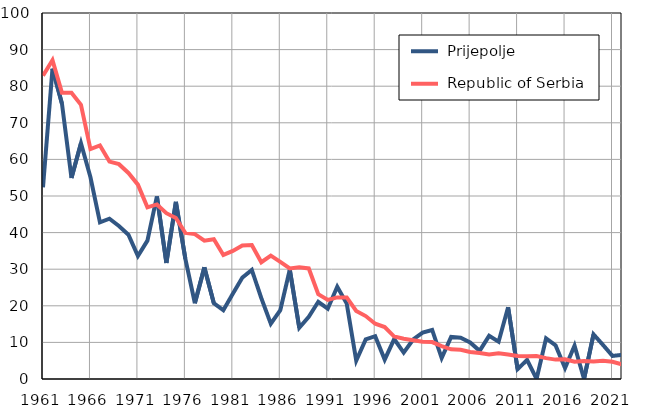
| Category |  Prijepolje |  Republic of Serbia |
|---|---|---|
| 1961.0 | 52.4 | 82.9 |
| 1962.0 | 84.8 | 87.1 |
| 1963.0 | 75.2 | 78.2 |
| 1964.0 | 54.9 | 78.2 |
| 1965.0 | 64.4 | 74.9 |
| 1966.0 | 55.1 | 62.8 |
| 1967.0 | 42.8 | 63.8 |
| 1968.0 | 43.8 | 59.4 |
| 1969.0 | 41.8 | 58.7 |
| 1970.0 | 39.4 | 56.3 |
| 1971.0 | 33.6 | 53.1 |
| 1972.0 | 37.8 | 46.9 |
| 1973.0 | 49.9 | 47.7 |
| 1974.0 | 31.7 | 45.3 |
| 1975.0 | 48.4 | 44 |
| 1976.0 | 32.8 | 39.9 |
| 1977.0 | 20.7 | 39.6 |
| 1978.0 | 30.5 | 37.8 |
| 1979.0 | 20.7 | 38.2 |
| 1980.0 | 18.8 | 33.9 |
| 1981.0 | 23.3 | 35 |
| 1982.0 | 27.7 | 36.5 |
| 1983.0 | 29.8 | 36.6 |
| 1984.0 | 22.1 | 31.9 |
| 1985.0 | 15.1 | 33.7 |
| 1986.0 | 18.8 | 32 |
| 1987.0 | 29.9 | 30.2 |
| 1988.0 | 14 | 30.5 |
| 1989.0 | 17 | 30.2 |
| 1990.0 | 21.1 | 23.2 |
| 1991.0 | 19.2 | 21.6 |
| 1992.0 | 25.2 | 22.3 |
| 1993.0 | 20.6 | 22.3 |
| 1994.0 | 5 | 18.6 |
| 1995.0 | 10.8 | 17.2 |
| 1996.0 | 11.7 | 15.1 |
| 1997.0 | 5.3 | 14.2 |
| 1998.0 | 10.9 | 11.6 |
| 1999.0 | 7.2 | 11 |
| 2000.0 | 10.8 | 10.6 |
| 2001.0 | 12.7 | 10.2 |
| 2002.0 | 13.4 | 10.1 |
| 2003.0 | 5.7 | 9 |
| 2004.0 | 11.5 | 8.1 |
| 2005.0 | 11.3 | 8 |
| 2006.0 | 10 | 7.4 |
| 2007.0 | 7.7 | 7.1 |
| 2008.0 | 11.8 | 6.7 |
| 2009.0 | 10.2 | 7 |
| 2010.0 | 19.6 | 6.7 |
| 2011.0 | 2.7 | 6.3 |
| 2012.0 | 5.2 | 6.2 |
| 2013.0 | 0 | 6.3 |
| 2014.0 | 11.1 | 5.7 |
| 2015.0 | 9.2 | 5.3 |
| 2016.0 | 3 | 5.4 |
| 2017.0 | 9.1 | 4.7 |
| 2018.0 | 0 | 4.9 |
| 2019.0 | 12.2 | 4.8 |
| 2020.0 | 9.3 | 5 |
| 2021.0 | 6.3 | 4.7 |
| 2022.0 | 6.6 | 4 |